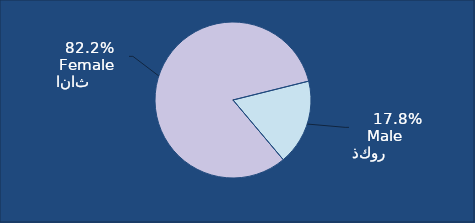
| Category | Series 0 |
|---|---|
| ذكور             Male      | 167811 |
|  اناث         Female  | 777512 |